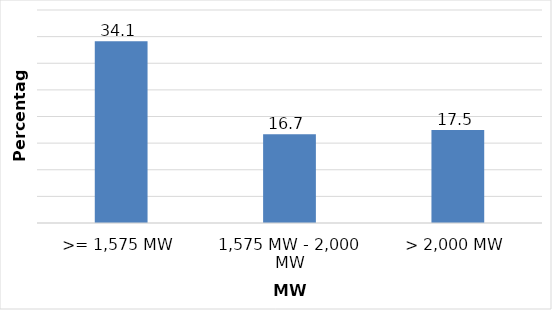
| Category | Series 0 |
|---|---|
| >= 1,575 MW | 34.112 |
| 1,575 MW - 2,000 MW | 16.66 |
| > 2,000 MW | 17.452 |